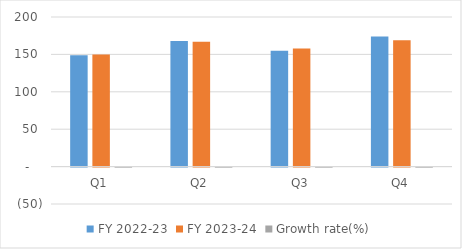
| Category | FY 2022-23 | FY 2023-24 | Growth rate(%) |
|---|---|---|---|
| Q1 | 149 | 150 | 0.007 |
| Q2 | 168 | 167 | -0.006 |
| Q3 | 155 | 158 | 0.019 |
| Q4 | 174 | 169 | -0.029 |